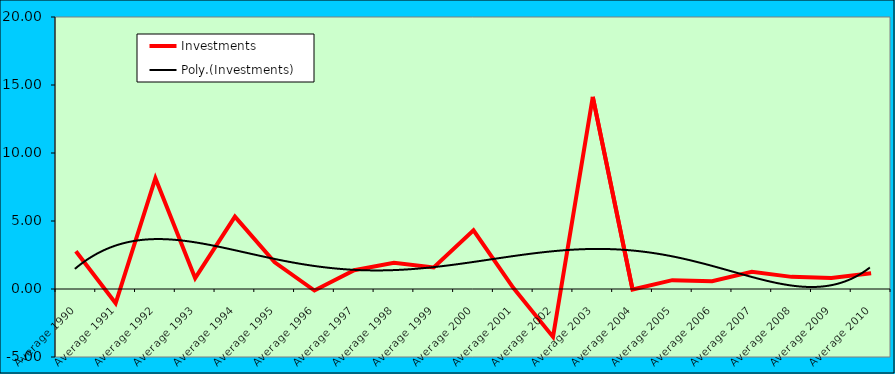
| Category | Investments |
|---|---|
| Average 1990 | 2.78 |
| Average 1991 | -1.046 |
| Average 1992 | 8.147 |
| Average 1993 | 0.8 |
| Average 1994 | 5.317 |
| Average 1995 | 1.962 |
| Average 1996 | -0.112 |
| Average 1997 | 1.382 |
| Average 1998 | 1.927 |
| Average 1999 | 1.584 |
| Average 2000 | 4.311 |
| Average 2001 | 0.087 |
| Average 2002 | -3.521 |
| Average 2003 | 14.131 |
| Average 2004 | -0.035 |
| Average 2005 | 0.651 |
| Average 2006 | 0.577 |
| Average 2007 | 1.263 |
| Average 2008 | 0.892 |
| Average 2009 | 0.802 |
| Average 2010 | 1.162 |